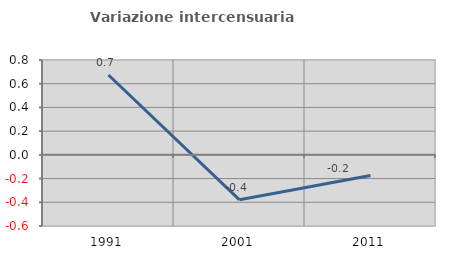
| Category | Variazione intercensuaria annua |
|---|---|
| 1991.0 | 0.673 |
| 2001.0 | -0.379 |
| 2011.0 | -0.174 |